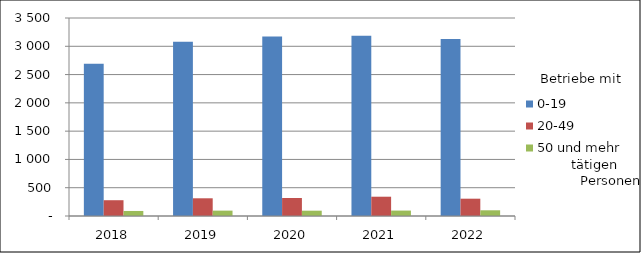
| Category | 0-19 | 20-49 | 50 und mehr |
|---|---|---|---|
| 2018.0 | 2691 | 279 | 89 |
| 2019.0 | 3080 | 313 | 95 |
| 2020.0 | 3171 | 318 | 94 |
| 2021.0 | 3185 | 341 | 96 |
| 2022.0 | 3127 | 306 | 101 |